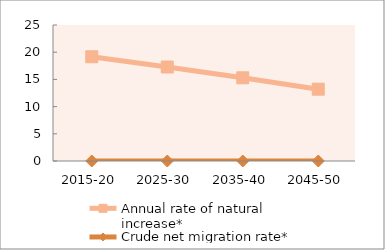
| Category | Annual rate of natural increase* | Crude net migration rate* |
|---|---|---|
| 2015-20 | 19.163 | 0 |
| 2025-30 | 17.276 | 0 |
| 2035-40 | 15.296 | 0 |
| 2045-50 | 13.201 | 0 |